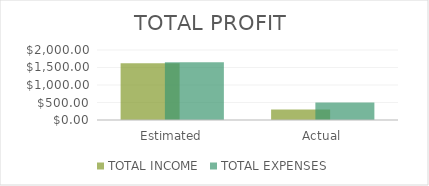
| Category | TOTAL INCOME | TOTAL EXPENSES |
|---|---|---|
| Estimated | 1620 | 1650 |
| Actual | 300 | 500 |